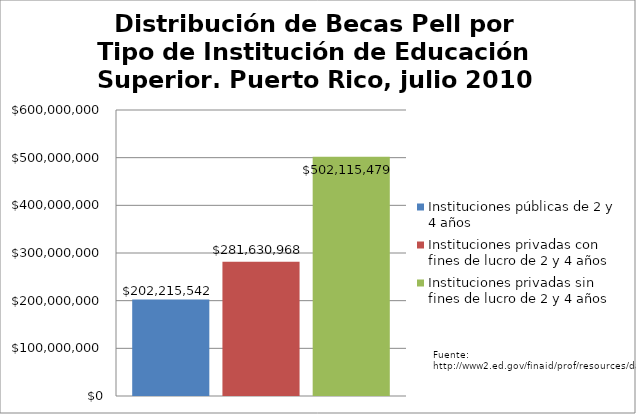
| Category | Instituciones públicas de 2 y 4 años | Instituciones privadas con fines de lucro de 2 y 4 años | Instituciones privadas sin fines de lucro de 2 y 4 años |
|---|---|---|---|
| Monto$ | 202215542 | 281630968 | 502115479 |